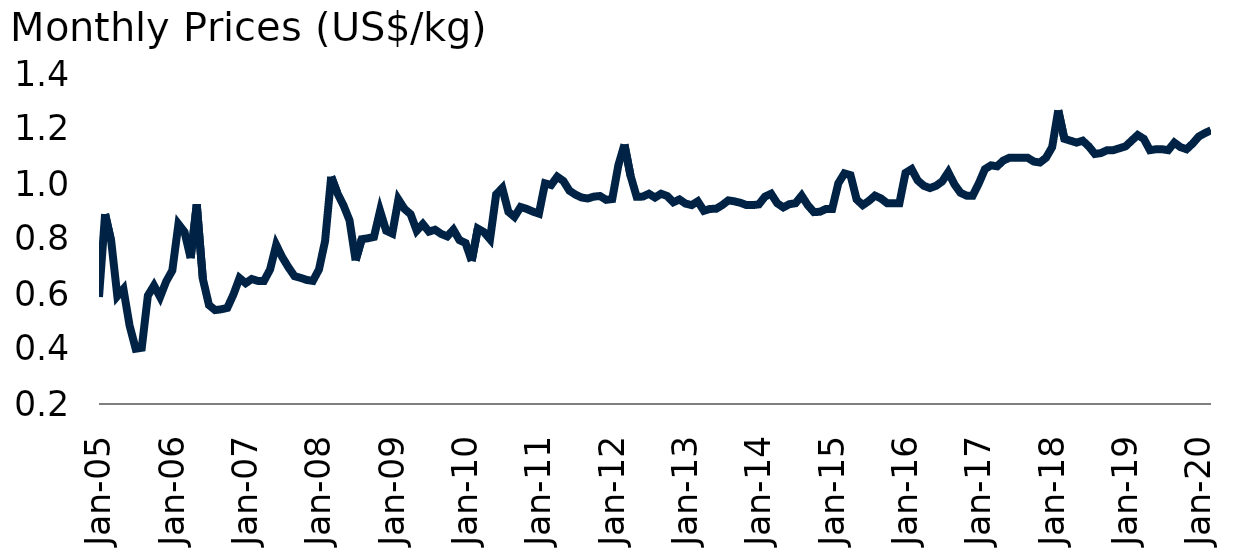
| Category | Banana.us |
|---|---|
| 2005-01-01 | 0.589 |
| 2005-02-01 | 0.89 |
| 2005-03-01 | 0.792 |
| 2005-04-01 | 0.593 |
| 2005-05-01 | 0.618 |
| 2005-06-01 | 0.486 |
| 2005-07-01 | 0.401 |
| 2005-08-01 | 0.405 |
| 2005-09-01 | 0.594 |
| 2005-10-01 | 0.63 |
| 2005-11-01 | 0.589 |
| 2005-12-01 | 0.646 |
| 2006-01-01 | 0.686 |
| 2006-02-01 | 0.854 |
| 2006-03-01 | 0.825 |
| 2006-04-01 | 0.73 |
| 2006-05-01 | 0.926 |
| 2006-06-01 | 0.655 |
| 2006-07-01 | 0.56 |
| 2006-08-01 | 0.542 |
| 2006-09-01 | 0.544 |
| 2006-10-01 | 0.549 |
| 2006-11-01 | 0.598 |
| 2006-12-01 | 0.658 |
| 2007-01-01 | 0.639 |
| 2007-02-01 | 0.655 |
| 2007-03-01 | 0.648 |
| 2007-04-01 | 0.648 |
| 2007-05-01 | 0.689 |
| 2007-06-01 | 0.779 |
| 2007-07-01 | 0.734 |
| 2007-08-01 | 0.697 |
| 2007-09-01 | 0.665 |
| 2007-10-01 | 0.659 |
| 2007-11-01 | 0.651 |
| 2007-12-01 | 0.648 |
| 2008-01-01 | 0.689 |
| 2008-02-01 | 0.792 |
| 2008-03-01 | 1.027 |
| 2008-04-01 | 0.967 |
| 2008-05-01 | 0.923 |
| 2008-06-01 | 0.868 |
| 2008-07-01 | 0.722 |
| 2008-08-01 | 0.799 |
| 2008-09-01 | 0.803 |
| 2008-10-01 | 0.807 |
| 2008-11-01 | 0.903 |
| 2008-12-01 | 0.83 |
| 2009-01-01 | 0.82 |
| 2009-02-01 | 0.944 |
| 2009-03-01 | 0.909 |
| 2009-04-01 | 0.89 |
| 2009-05-01 | 0.83 |
| 2009-06-01 | 0.854 |
| 2009-07-01 | 0.827 |
| 2009-08-01 | 0.834 |
| 2009-09-01 | 0.818 |
| 2009-10-01 | 0.81 |
| 2009-11-01 | 0.834 |
| 2009-12-01 | 0.796 |
| 2010-01-01 | 0.785 |
| 2010-02-01 | 0.72 |
| 2010-03-01 | 0.838 |
| 2010-04-01 | 0.825 |
| 2010-05-01 | 0.799 |
| 2010-06-01 | 0.962 |
| 2010-07-01 | 0.985 |
| 2010-08-01 | 0.899 |
| 2010-09-01 | 0.88 |
| 2010-10-01 | 0.916 |
| 2010-11-01 | 0.909 |
| 2010-12-01 | 0.9 |
| 2011-01-01 | 0.892 |
| 2011-02-01 | 1.002 |
| 2011-03-01 | 0.996 |
| 2011-04-01 | 1.027 |
| 2011-05-01 | 1.011 |
| 2011-06-01 | 0.976 |
| 2011-07-01 | 0.961 |
| 2011-08-01 | 0.951 |
| 2011-09-01 | 0.947 |
| 2011-10-01 | 0.954 |
| 2011-11-01 | 0.956 |
| 2011-12-01 | 0.942 |
| 2012-01-01 | 0.945 |
| 2012-02-01 | 1.068 |
| 2012-03-01 | 1.144 |
| 2012-04-01 | 1.03 |
| 2012-05-01 | 0.953 |
| 2012-06-01 | 0.954 |
| 2012-07-01 | 0.965 |
| 2012-08-01 | 0.951 |
| 2012-09-01 | 0.965 |
| 2012-10-01 | 0.956 |
| 2012-11-01 | 0.934 |
| 2012-12-01 | 0.944 |
| 2013-01-01 | 0.929 |
| 2013-02-01 | 0.923 |
| 2013-03-01 | 0.937 |
| 2013-04-01 | 0.903 |
| 2013-05-01 | 0.909 |
| 2013-06-01 | 0.91 |
| 2013-07-01 | 0.923 |
| 2013-08-01 | 0.94 |
| 2013-09-01 | 0.937 |
| 2013-10-01 | 0.931 |
| 2013-11-01 | 0.923 |
| 2013-12-01 | 0.923 |
| 2014-01-01 | 0.926 |
| 2014-02-01 | 0.954 |
| 2014-03-01 | 0.965 |
| 2014-04-01 | 0.93 |
| 2014-05-01 | 0.915 |
| 2014-06-01 | 0.927 |
| 2014-07-01 | 0.93 |
| 2014-08-01 | 0.958 |
| 2014-09-01 | 0.923 |
| 2014-10-01 | 0.898 |
| 2014-11-01 | 0.899 |
| 2014-12-01 | 0.909 |
| 2015-01-01 | 0.909 |
| 2015-02-01 | 1.002 |
| 2015-03-01 | 1.039 |
| 2015-04-01 | 1.032 |
| 2015-05-01 | 0.944 |
| 2015-06-01 | 0.923 |
| 2015-07-01 | 0.938 |
| 2015-08-01 | 0.958 |
| 2015-09-01 | 0.947 |
| 2015-10-01 | 0.93 |
| 2015-11-01 | 0.93 |
| 2015-12-01 | 0.93 |
| 2016-01-01 | 1.04 |
| 2016-02-01 | 1.054 |
| 2016-03-01 | 1.013 |
| 2016-04-01 | 0.993 |
| 2016-05-01 | 0.985 |
| 2016-06-01 | 0.993 |
| 2016-07-01 | 1.009 |
| 2016-08-01 | 1.043 |
| 2016-09-01 | 0.999 |
| 2016-10-01 | 0.968 |
| 2016-11-01 | 0.958 |
| 2016-12-01 | 0.958 |
| 2017-01-01 | 1.002 |
| 2017-02-01 | 1.054 |
| 2017-03-01 | 1.068 |
| 2017-04-01 | 1.064 |
| 2017-05-01 | 1.085 |
| 2017-06-01 | 1.095 |
| 2017-07-01 | 1.095 |
| 2017-08-01 | 1.095 |
| 2017-09-01 | 1.095 |
| 2017-10-01 | 1.082 |
| 2017-11-01 | 1.078 |
| 2017-12-01 | 1.095 |
| 2018-01-01 | 1.134 |
| 2018-02-01 | 1.268 |
| 2018-03-01 | 1.164 |
| 2018-04-01 | 1.157 |
| 2018-05-01 | 1.151 |
| 2018-06-01 | 1.157 |
| 2018-07-01 | 1.137 |
| 2018-08-01 | 1.109 |
| 2018-09-01 | 1.113 |
| 2018-10-01 | 1.123 |
| 2018-11-01 | 1.123 |
| 2018-12-01 | 1.13 |
| 2019-01-01 | 1.137 |
| 2019-02-01 | 1.157 |
| 2019-03-01 | 1.178 |
| 2019-04-01 | 1.164 |
| 2019-05-01 | 1.123 |
| 2019-06-01 | 1.126 |
| 2019-07-01 | 1.126 |
| 2019-08-01 | 1.123 |
| 2019-09-01 | 1.151 |
| 2019-10-01 | 1.134 |
| 2019-11-01 | 1.126 |
| 2019-12-01 | 1.147 |
| 2020-01-01 | 1.173 |
| 2020-02-01 | 1.185 |
| 2020-03-01 | 1.195 |